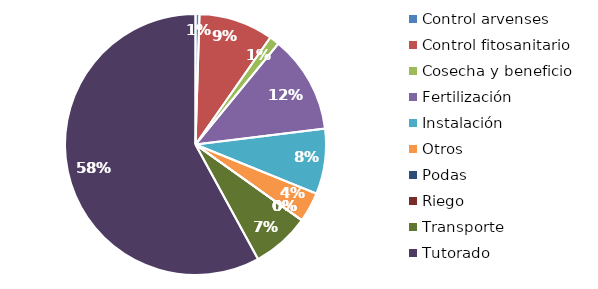
| Category | Valor |
|---|---|
| Control arvenses | 55858 |
| Control fitosanitario | 1049916 |
| Cosecha y beneficio | 140836.282 |
| Fertilización | 1378483 |
| Instalación | 922722.862 |
| Otros | 422508 |
| Podas | 0 |
| Riego | 0 |
| Transporte | 818648 |
| Tutorado | 6601701 |